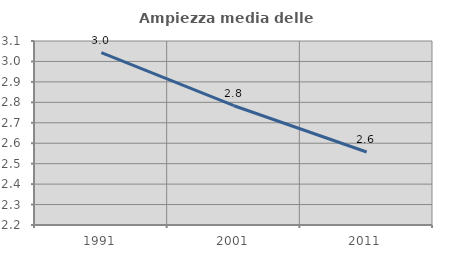
| Category | Ampiezza media delle famiglie |
|---|---|
| 1991.0 | 3.044 |
| 2001.0 | 2.783 |
| 2011.0 | 2.557 |